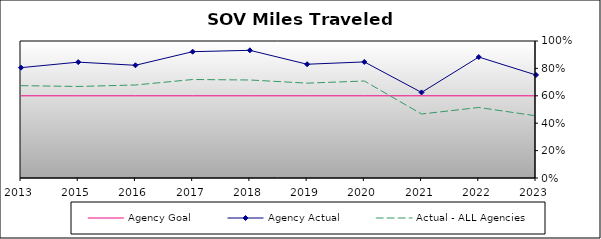
| Category | Agency Goal | Agency Actual | Actual - ALL Agencies |
|---|---|---|---|
| 2013.0 | 0.6 | 0.805 | 0.674 |
| 2015.0 | 0.6 | 0.846 | 0.668 |
| 2016.0 | 0.6 | 0.823 | 0.679 |
| 2017.0 | 0.6 | 0.922 | 0.719 |
| 2018.0 | 0.6 | 0.932 | 0.715 |
| 2019.0 | 0.6 | 0.83 | 0.692 |
| 2020.0 | 0.6 | 0.847 | 0.708 |
| 2021.0 | 0.6 | 0.624 | 0.467 |
| 2022.0 | 0.6 | 0.883 | 0.515 |
| 2023.0 | 0.6 | 0.752 | 0.454 |